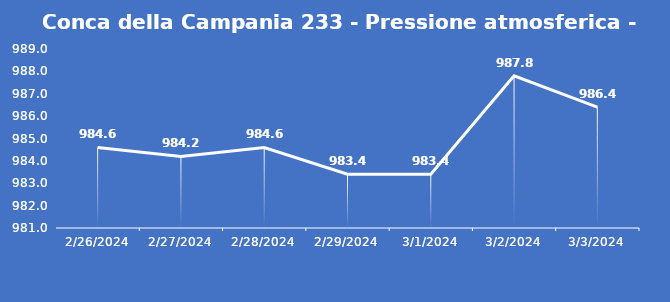
| Category | Conca della Campania 233 - Pressione atmosferica - Grezzo (hPa) |
|---|---|
| 2/26/24 | 984.6 |
| 2/27/24 | 984.2 |
| 2/28/24 | 984.6 |
| 2/29/24 | 983.4 |
| 3/1/24 | 983.4 |
| 3/2/24 | 987.8 |
| 3/3/24 | 986.4 |